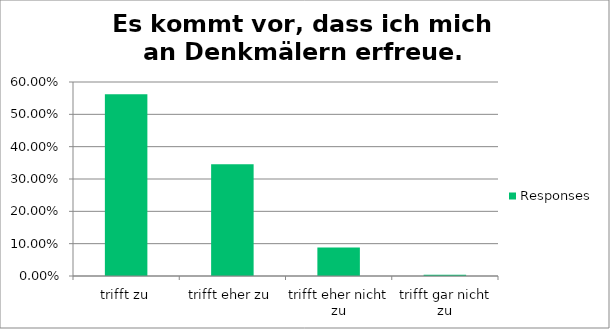
| Category | Responses |
|---|---|
| trifft zu | 0.562 |
| trifft eher zu | 0.345 |
| trifft eher nicht zu | 0.088 |
| trifft gar nicht zu | 0.004 |